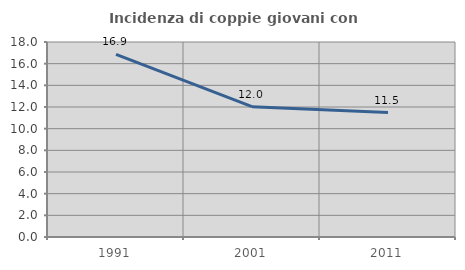
| Category | Incidenza di coppie giovani con figli |
|---|---|
| 1991.0 | 16.862 |
| 2001.0 | 12.033 |
| 2011.0 | 11.491 |